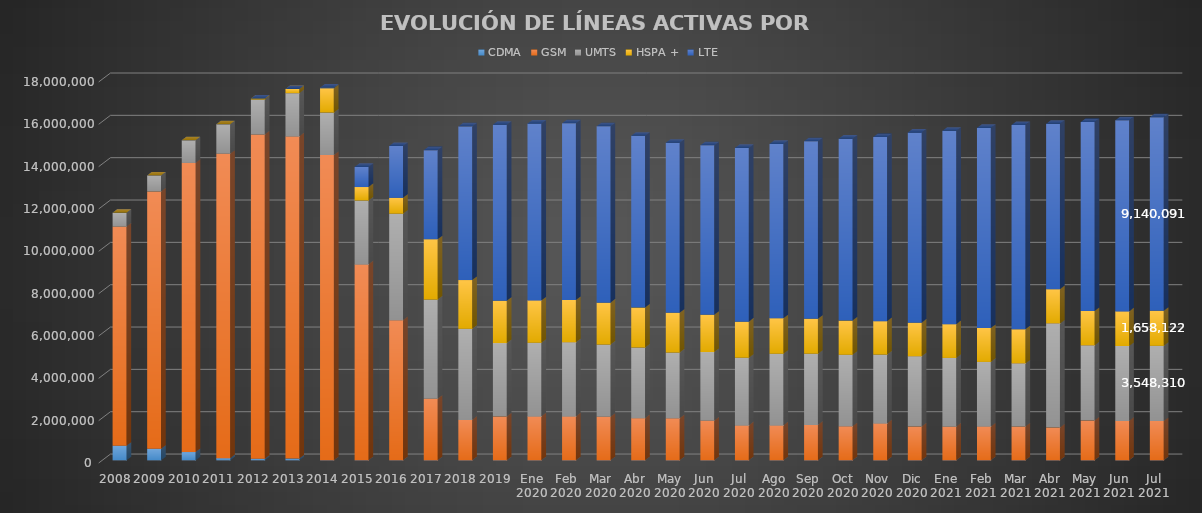
| Category | CDMA | GSM | UMTS | HSPA + | LTE |
|---|---|---|---|---|---|
| 2008 | 688357 | 10346902 | 656989 | 0 | 0 |
| 2009 | 544313 | 12151710 | 758577 | 0 | 0 |
| 2010 | 389834 | 13657394 | 1071603 | 0 | 0 |
| 2011 | 102115 | 14379423 | 1393020 | 0 | 0 |
| 2012 | 75179 | 15310006 | 1658596 | 43082 | 0 |
| 2013 | 83748 | 15215287 | 2043321 | 199398 | 0 |
| 2014 | 3009 | 14418144 | 2006405 | 1148823 | 28176 |
| 2015 | 0 | 9252920 | 3019889 | 636488 | 949723 |
| 2016 | 0 | 6621574 | 5027714 | 748032 | 2450814 |
| 2017 | 0 | 2903370.634 | 4688270.066 | 2852941.199 | 4206822.101 |
| 2018 | 0 | 1909938.891 | 4302462.415 | 2301651 | 7258785.694 |
| 2019 | 0 | 2068130.505 | 3468519.705 | 1995507 | 8320942.79 |
| Ene 2020 | 0 | 2073655.568 | 3478820.178 | 1998196 | 8356285.254 |
| Feb 2020 | 0 | 2072904.519 | 3498359.253 | 2001967 | 8345227.229 |
| Mar 2020 | 0 | 2058064.417 | 3407979.081 | 1980718 | 8332459.502 |
| Abr 2020 | 0 | 1991765.546 | 3335592.93 | 1891516 | 8112011.524 |
| May 2020 | 0 | 1984182.941 | 3104565.638 | 1883312 | 8029861.421 |
| Jun 2020 | 0 | 1874085.045 | 3239208.945 | 1763508 | 8000974.011 |
| Jul 2020 | 0 | 1647164.681 | 3199151.558 | 1701928 | 8208826.761 |
| Ago 2020 | 0 | 1649555.106 | 3383987.03 | 1678987 | 8233270.864 |
| Sep 2020 | 0 | 1672055.632 | 3363437.797 | 1650055 | 8385277.572 |
| Oct 2020 | 0 | 1606916.453 | 3378292.838 | 1616262 | 8591169.708 |
| Nov 2020 | 0 | 1743826.763 | 3249009.433 | 1582090 | 8694401.804 |
| Dic 2020 | 0 | 1595680.621 | 3315009.099 | 1591073 | 8983603.28 |
| Ene 2021 | 0 | 1587783.73 | 3249285.841 | 1594963 | 9130917.428 |
| Feb 2021 | 0 | 1598501 | 3049945 | 1602560 | 9450529 |
| Mar 2021 | 0 | 1593140.519 | 2980982.345 | 1614608 | 9651821.135 |
| Abr 2021 | 0 | 1550141.025 | 4914584.364 | 1619119 | 7810763.612 |
| May 2021 | 0 | 1876083.657 | 3550221.948 | 1626722 | 8923231.396 |
| Jun 2021 | 0 | 1861585.656 | 3537165.914 | 1635292 | 9026579.43 |
| Jul 2021 | 0 | 1859157.489 | 3548309.999 | 1658122 | 9140090.512 |